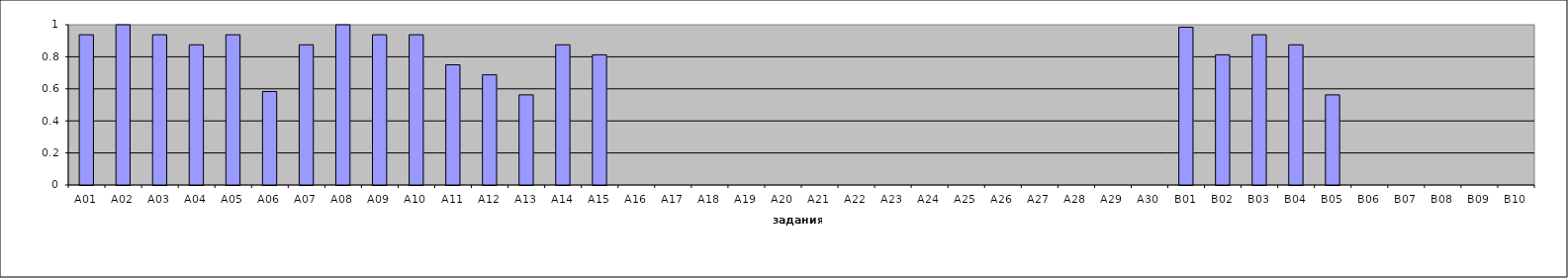
| Category | Общие результаты по тесту |
|---|---|
| A01 | 0.938 |
| A02 | 1 |
| A03 | 0.938 |
| A04 | 0.875 |
| A05 | 0.938 |
| A06 | 0.583 |
| A07 | 0.875 |
| A08 | 1 |
| A09 | 0.938 |
| A10 | 0.938 |
| A11 | 0.75 |
| A12 | 0.688 |
| A13 | 0.562 |
| A14 | 0.875 |
| A15 | 0.812 |
| A16 | 0 |
| A17 | 0 |
| A18 | 0 |
| A19 | 0 |
| A20 | 0 |
| A21 | 0 |
| A22 | 0 |
| A23 | 0 |
| A24 | 0 |
| A25 | 0 |
| A26 | 0 |
| A27 | 0 |
| A28 | 0 |
| A29 | 0 |
| A30 | 0 |
| B01 | 0.984 |
| B02 | 0.812 |
| B03 | 0.938 |
| B04 | 0.875 |
| B05 | 0.562 |
| B06 | 0 |
| B07 | 0 |
| B08 | 0 |
| B09 | 0 |
| B10 | 0 |